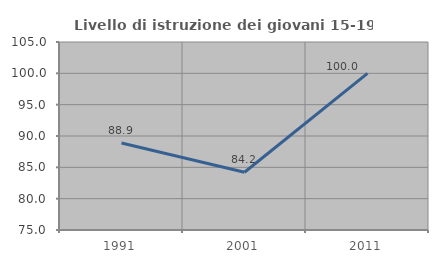
| Category | Livello di istruzione dei giovani 15-19 anni |
|---|---|
| 1991.0 | 88.889 |
| 2001.0 | 84.211 |
| 2011.0 | 100 |